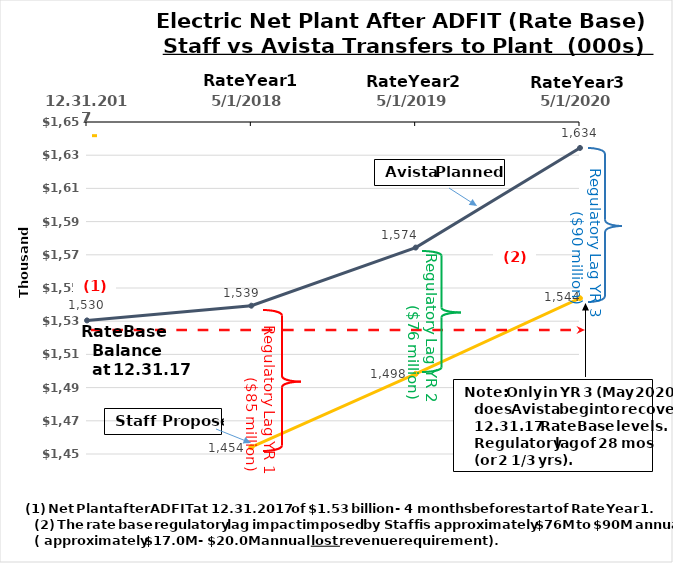
| Category | Staff | Avista Planned |
|---|---|---|
| 12.31.2017 | 1454074 | 1530469 |
| 5/1/2018 | 1454074 | 1539337 |
| 5/1/2019 | 1498277.85 | 1574348 |
| 5/1/2020 | 1543825.496 | 1634379 |